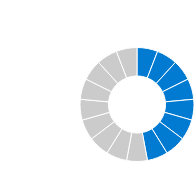
| Category | Change in prices |
|---|---|
| 0 | 1 |
| 1 | 1 |
| 2 | 1 |
| 3 | 1 |
| 4 | 1 |
| 5 | 1 |
| 6 | 1 |
| 7 | 1 |
| 8 | 1 |
| 9 | 1 |
| 10 | 1 |
| 11 | 1 |
| 12 | 1 |
| 13 | 1 |
| 14 | 1 |
| 15 | 1 |
| 16 | 1 |